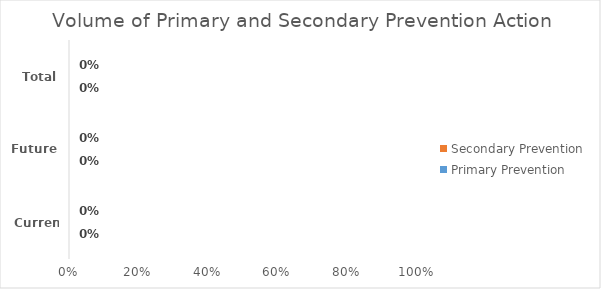
| Category | Primary Prevention | Secondary Prevention |
|---|---|---|
| 0 | 0 | 0 |
| 1 | 0 | 0 |
| 2 | 0 | 0 |